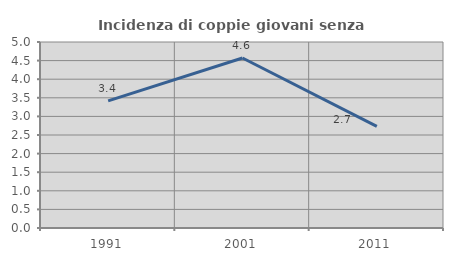
| Category | Incidenza di coppie giovani senza figli |
|---|---|
| 1991.0 | 3.416 |
| 2001.0 | 4.57 |
| 2011.0 | 2.732 |